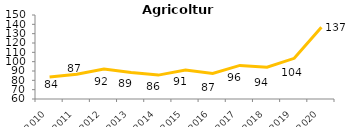
| Category | Agricoltura |
|---|---|
| 2010.0 | 83.6 |
| 2011.0 | 86.5 |
| 2012.0 | 92.1 |
| 2013.0 | 88.5 |
| 2014.0 | 85.6 |
| 2015.0 | 91 |
| 2016.0 | 87.4 |
| 2017.0 | 96 |
| 2018.0 | 94.1 |
| 2019.0 | 103.6 |
| 2020.0 | 136.8 |